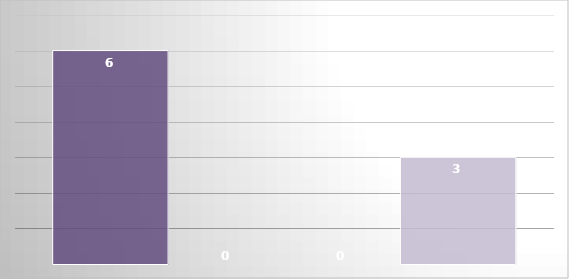
| Category | RESPONDIDAS  | PENDIENTES DE RETIRAR  | ENVIADAS A OTRA INSTITUCIÓN  | EN PROCESO  |
|---|---|---|---|---|
| 0 | 6 | 0 | 0 | 3 |